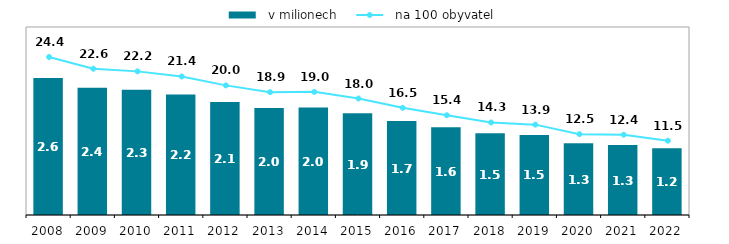
| Category |   v milionech |
|---|---|
| 2008.0 | 2.551 |
| 2009.0 | 2.371 |
| 2010.0 | 2.334 |
| 2011.0 | 2.245 |
| 2012.0 | 2.103 |
| 2013.0 | 1.992 |
| 2014.0 | 2.002 |
| 2015.0 | 1.896 |
| 2016.0 | 1.749 |
| 2017.0 | 1.633 |
| 2018.0 | 1.52 |
| 2019.0 | 1.491 |
| 2020.0 | 1.334 |
| 2021.0 | 1.302 |
| 2022.0 | 1.241 |